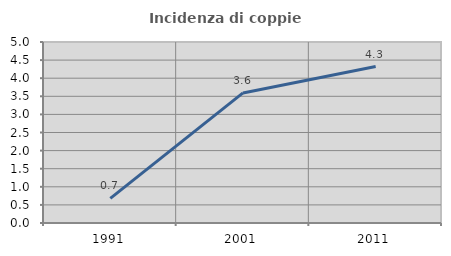
| Category | Incidenza di coppie miste |
|---|---|
| 1991.0 | 0.68 |
| 2001.0 | 3.593 |
| 2011.0 | 4.322 |